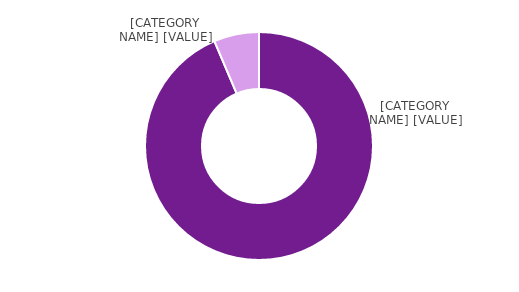
| Category | Series 0 |
|---|---|
| Men | 0.936 |
| Women | 0.064 |